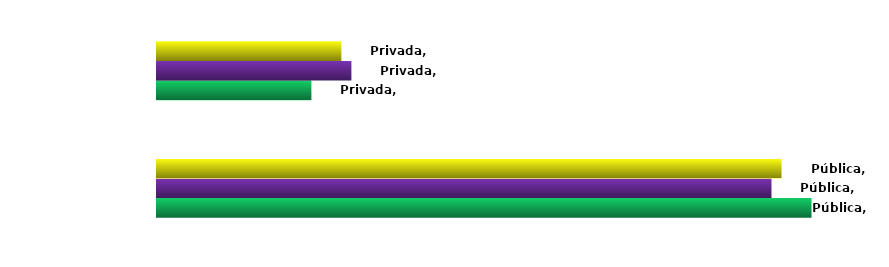
| Category | Ingressantes | Concluintes | Matriculados |
|---|---|---|---|
| Pública | 0.809 | 0.76 | 0.772 |
| Privada | 0.191 | 0.24 | 0.228 |